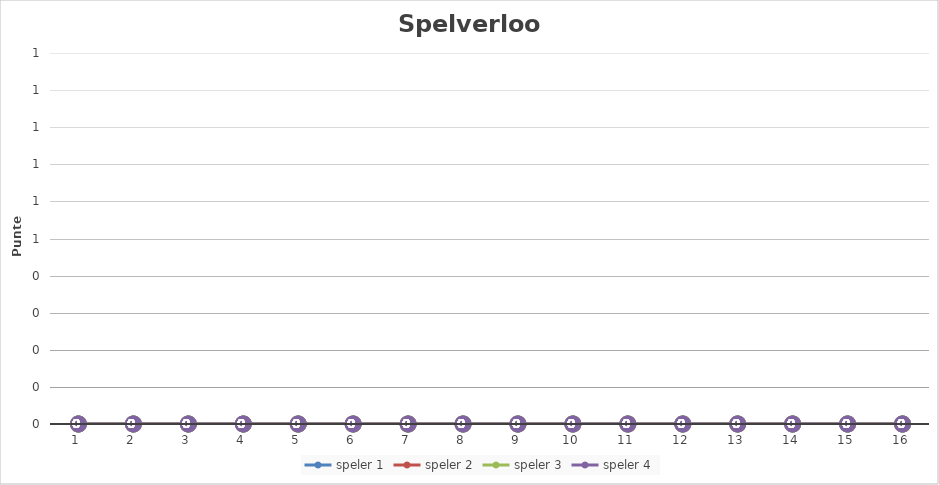
| Category | speler 1 | speler 2 | speler 3 | speler 4 |
|---|---|---|---|---|
| 0 | 0 | 0 | 0 | 0 |
| 1 | 0 | 0 | 0 | 0 |
| 2 | 0 | 0 | 0 | 0 |
| 3 | 0 | 0 | 0 | 0 |
| 4 | 0 | 0 | 0 | 0 |
| 5 | 0 | 0 | 0 | 0 |
| 6 | 0 | 0 | 0 | 0 |
| 7 | 0 | 0 | 0 | 0 |
| 8 | 0 | 0 | 0 | 0 |
| 9 | 0 | 0 | 0 | 0 |
| 10 | 0 | 0 | 0 | 0 |
| 11 | 0 | 0 | 0 | 0 |
| 12 | 0 | 0 | 0 | 0 |
| 13 | 0 | 0 | 0 | 0 |
| 14 | 0 | 0 | 0 | 0 |
| 15 | 0 | 0 | 0 | 0 |